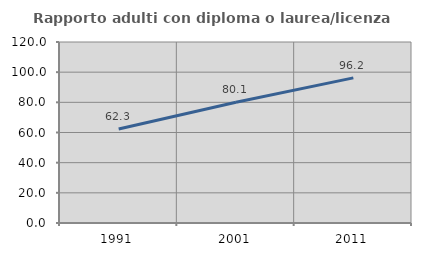
| Category | Rapporto adulti con diploma o laurea/licenza media  |
|---|---|
| 1991.0 | 62.264 |
| 2001.0 | 80.083 |
| 2011.0 | 96.22 |